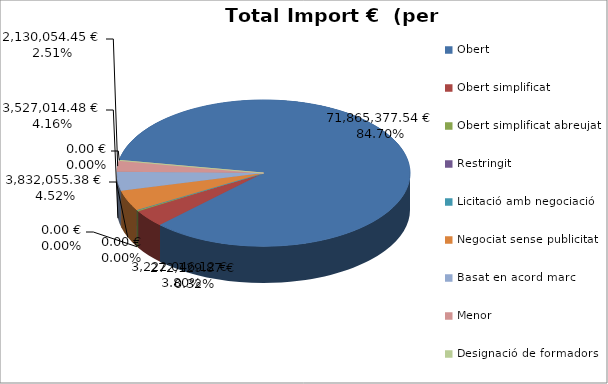
| Category | Total preu              (amb iva) |
|---|---|
| Obert | 71865377.538 |
| Obert simplificat | 3222046.116 |
| Obert simplificat abreujat | 272129.868 |
| Restringit | 0 |
| Licitació amb negociació | 0 |
| Negociat sense publicitat | 3832055.375 |
| Basat en acord marc | 3527014.483 |
| Menor | 2130054.448 |
| Designació de formadors | 0 |